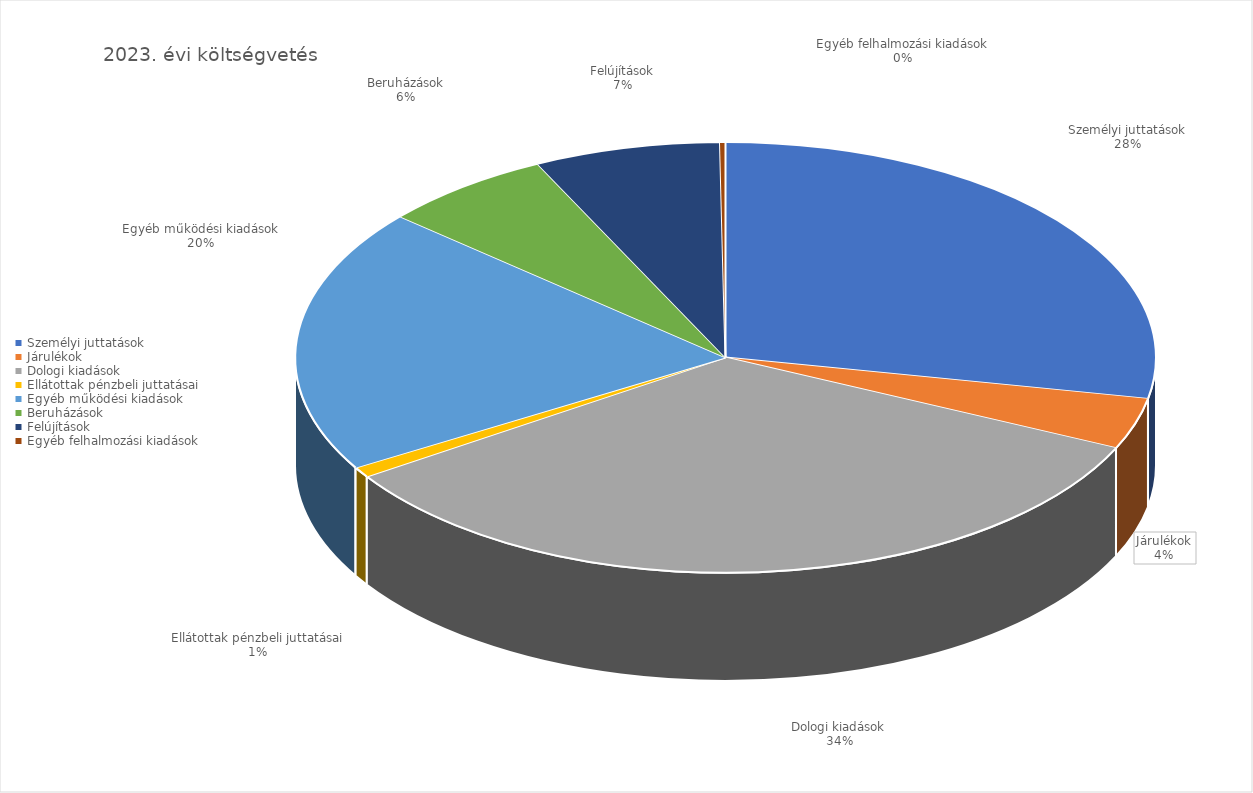
| Category | 2023 |
|---|---|
| Személyi juttatások | 13836537368 |
| Járulékok | 1889212622 |
| Dologi kiadások | 16631759826 |
| Ellátottak pénzbeli juttatásai | 384407330 |
| Egyéb működési kiadások | 9806710864 |
| Beruházások | 3176181280 |
| Felújítások | 3446151278 |
| Egyéb felhalmozási kiadások | 100712499 |